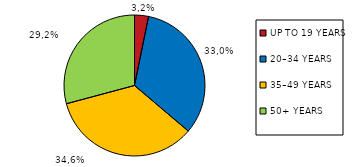
| Category | Series 0 |
|---|---|
| UP TO 19 YEARS | 17370 |
| 20–34 YEARS | 178752 |
| 35–49 YEARS | 187705 |
| 50+ YEARS | 158087 |